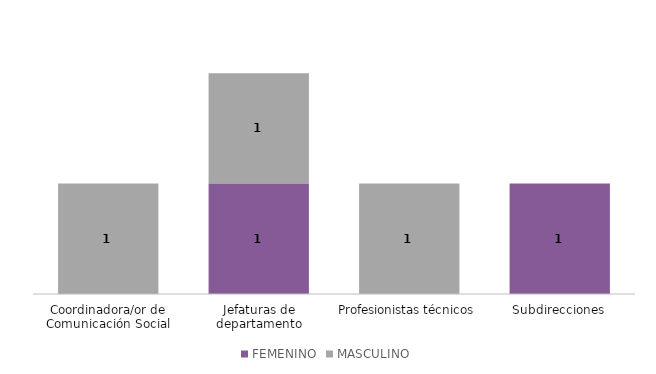
| Category | FEMENINO | MASCULINO |
|---|---|---|
| Coordinadora/or de Comunicación Social | 0 | 1 |
| Jefaturas de departamento | 1 | 1 |
| Profesionistas técnicos | 0 | 1 |
| Subdirecciones | 1 | 0 |